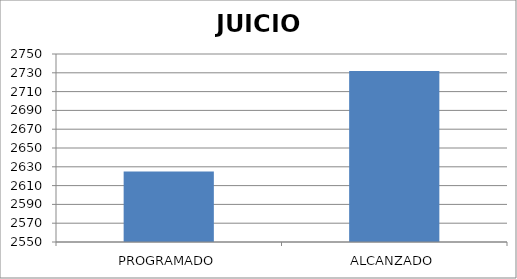
| Category | JUICIO |
|---|---|
| PROGRAMADO | 2625 |
| ALCANZADO | 2732 |